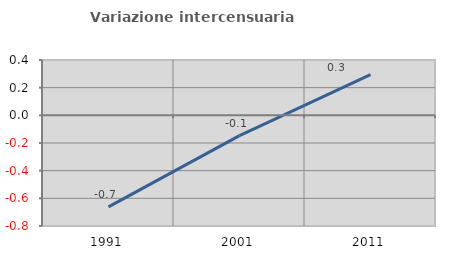
| Category | Variazione intercensuaria annua |
|---|---|
| 1991.0 | -0.661 |
| 2001.0 | -0.147 |
| 2011.0 | 0.295 |